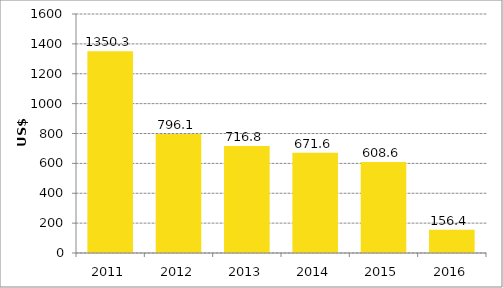
| Category | Series 0 |
|---|---|
| 2011.0 | 1350.349 |
| 2012.0 | 796.064 |
| 2013.0 | 716.796 |
| 2014.0 | 671.642 |
| 2015.0 | 608.552 |
| 2016.0 | 156.382 |